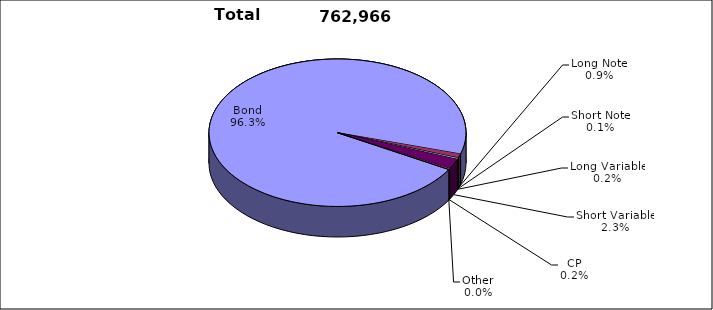
| Category | Trades |
|---|---|
| Bond | 734854 |
| Long Note | 6841 |
| Short Note | 743 |
| Long Variable | 1586 |
| Short Variable | 17470 |
| CP | 1258 |
| Other | 214 |